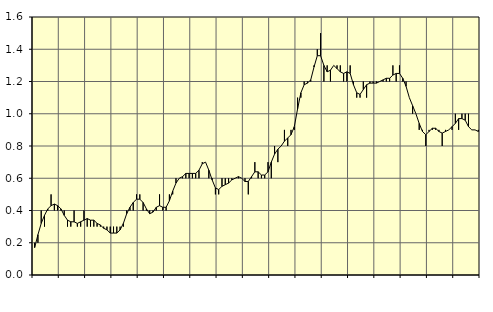
| Category | Piggar | Fast anställda utomlands |
|---|---|---|
| nan | 0.2 | 0.17 |
| 87.0 | 0.2 | 0.25 |
| 87.0 | 0.4 | 0.32 |
| 87.0 | 0.3 | 0.37 |
| nan | 0.4 | 0.41 |
| 88.0 | 0.5 | 0.43 |
| 88.0 | 0.4 | 0.44 |
| 88.0 | 0.4 | 0.43 |
| nan | 0.4 | 0.41 |
| 89.0 | 0.4 | 0.37 |
| 89.0 | 0.3 | 0.34 |
| 89.0 | 0.3 | 0.33 |
| nan | 0.4 | 0.33 |
| 90.0 | 0.3 | 0.32 |
| 90.0 | 0.3 | 0.33 |
| 90.0 | 0.4 | 0.34 |
| nan | 0.3 | 0.35 |
| 91.0 | 0.3 | 0.34 |
| 91.0 | 0.3 | 0.34 |
| 91.0 | 0.3 | 0.32 |
| nan | 0.3 | 0.31 |
| 92.0 | 0.3 | 0.29 |
| 92.0 | 0.3 | 0.28 |
| 92.0 | 0.3 | 0.26 |
| nan | 0.3 | 0.26 |
| 93.0 | 0.3 | 0.26 |
| 93.0 | 0.3 | 0.28 |
| 93.0 | 0.3 | 0.32 |
| nan | 0.4 | 0.38 |
| 94.0 | 0.4 | 0.42 |
| 94.0 | 0.4 | 0.45 |
| 94.0 | 0.5 | 0.47 |
| nan | 0.5 | 0.47 |
| 95.0 | 0.4 | 0.45 |
| 95.0 | 0.4 | 0.41 |
| 95.0 | 0.4 | 0.38 |
| nan | 0.4 | 0.39 |
| 96.0 | 0.4 | 0.42 |
| 96.0 | 0.5 | 0.43 |
| 96.0 | 0.4 | 0.42 |
| nan | 0.4 | 0.42 |
| 97.0 | 0.5 | 0.46 |
| 97.0 | 0.5 | 0.52 |
| 97.0 | 0.6 | 0.57 |
| nan | 0.6 | 0.6 |
| 98.0 | 0.6 | 0.61 |
| 98.0 | 0.6 | 0.63 |
| 98.0 | 0.6 | 0.63 |
| nan | 0.6 | 0.63 |
| 99.0 | 0.6 | 0.63 |
| 99.0 | 0.6 | 0.65 |
| 99.0 | 0.7 | 0.69 |
| nan | 0.7 | 0.7 |
| 0.0 | 0.6 | 0.65 |
| 0.0 | 0.6 | 0.59 |
| 0.0 | 0.5 | 0.54 |
| nan | 0.5 | 0.53 |
| 1.0 | 0.6 | 0.55 |
| 1.0 | 0.6 | 0.56 |
| 1.0 | 0.6 | 0.57 |
| nan | 0.6 | 0.59 |
| 2.0 | 0.6 | 0.6 |
| 2.0 | 0.6 | 0.61 |
| 2.0 | 0.6 | 0.6 |
| nan | 0.6 | 0.58 |
| 3.0 | 0.5 | 0.58 |
| 3.0 | 0.6 | 0.61 |
| 3.0 | 0.7 | 0.64 |
| nan | 0.6 | 0.64 |
| 4.0 | 0.6 | 0.62 |
| 4.0 | 0.6 | 0.62 |
| 4.0 | 0.7 | 0.64 |
| nan | 0.6 | 0.7 |
| 5.0 | 0.8 | 0.75 |
| 5.0 | 0.7 | 0.78 |
| 5.0 | 0.8 | 0.8 |
| nan | 0.9 | 0.83 |
| 6.0 | 0.8 | 0.85 |
| 6.0 | 0.9 | 0.87 |
| 6.0 | 0.9 | 0.92 |
| nan | 1.1 | 1.03 |
| 7.0 | 1.1 | 1.13 |
| 7.0 | 1.2 | 1.18 |
| 7.0 | 1.2 | 1.19 |
| nan | 1.2 | 1.21 |
| 8.0 | 1.3 | 1.29 |
| 8.0 | 1.4 | 1.36 |
| 8.0 | 1.5 | 1.36 |
| nan | 1.2 | 1.3 |
| 9.0 | 1.3 | 1.26 |
| 9.0 | 1.2 | 1.27 |
| 9.0 | 1.3 | 1.3 |
| nan | 1.3 | 1.28 |
| 10.0 | 1.3 | 1.26 |
| 10.0 | 1.2 | 1.25 |
| 10.0 | 1.2 | 1.26 |
| nan | 1.3 | 1.25 |
| 11.0 | 1.2 | 1.18 |
| 11.0 | 1.1 | 1.13 |
| 11.0 | 1.1 | 1.12 |
| nan | 1.2 | 1.15 |
| 12.0 | 1.1 | 1.18 |
| 12.0 | 1.2 | 1.19 |
| 12.0 | 1.2 | 1.19 |
| nan | 1.2 | 1.19 |
| 13.0 | 1.2 | 1.2 |
| 13.0 | 1.2 | 1.21 |
| 13.0 | 1.2 | 1.22 |
| nan | 1.2 | 1.22 |
| 14.0 | 1.3 | 1.24 |
| 14.0 | 1.2 | 1.25 |
| 14.0 | 1.3 | 1.25 |
| nan | 1.2 | 1.22 |
| 15.0 | 1.2 | 1.17 |
| 15.0 | 1.1 | 1.1 |
| 15.0 | 1 | 1.05 |
| nan | 1 | 1 |
| 16.0 | 0.9 | 0.94 |
| 16.0 | 0.9 | 0.89 |
| 16.0 | 0.8 | 0.87 |
| nan | 0.9 | 0.89 |
| 17.0 | 0.9 | 0.91 |
| 17.0 | 0.9 | 0.91 |
| 17.0 | 0.9 | 0.89 |
| nan | 0.8 | 0.88 |
| 18.0 | 0.9 | 0.89 |
| 18.0 | 0.9 | 0.9 |
| 18.0 | 0.9 | 0.92 |
| nan | 1 | 0.94 |
| 19.0 | 0.9 | 0.97 |
| 19.0 | 1 | 0.97 |
| 19.0 | 1 | 0.96 |
| nan | 1 | 0.92 |
| 20.0 | 0.9 | 0.9 |
| 20.0 | 0.9 | 0.9 |
| 20.0 | 0.9 | 0.89 |